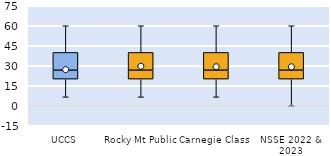
| Category | 25th | 50th | 75th |
|---|---|---|---|
| UCCS | 20 | 6.667 | 13.333 |
| Rocky Mt Public | 20 | 6.667 | 13.333 |
| Carnegie Class | 20 | 6.667 | 13.333 |
| NSSE 2022 & 2023 | 20 | 6.667 | 13.333 |